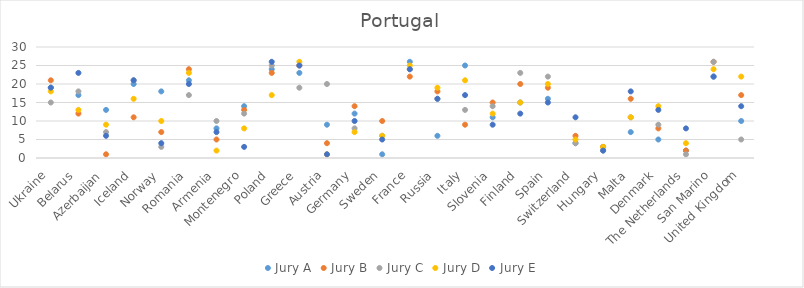
| Category | Jury A | Jury B | Jury C | Jury D | Jury E |
|---|---|---|---|---|---|
| Ukraine | 19 | 21 | 15 | 18 | 19 |
| Belarus | 17 | 12 | 18 | 13 | 23 |
| Azerbaijan | 13 | 1 | 7 | 9 | 6 |
| Iceland | 20 | 11 | 21 | 16 | 21 |
| Norway | 18 | 7 | 3 | 10 | 4 |
| Romania | 21 | 24 | 17 | 23 | 20 |
| Armenia | 8 | 5 | 10 | 2 | 7 |
| Montenegro | 14 | 13 | 12 | 8 | 3 |
| Poland | 24 | 23 | 25 | 17 | 26 |
| Greece | 23 | 25 | 19 | 26 | 25 |
| Austria | 9 | 4 | 20 | 1 | 1 |
| Germany | 12 | 14 | 8 | 7 | 10 |
| Sweden | 1 | 10 | 6 | 6 | 5 |
| France | 26 | 22 | 24 | 25 | 24 |
| Russia | 6 | 18 | 16 | 19 | 16 |
| Italy | 25 | 9 | 13 | 21 | 17 |
| Slovenia | 11 | 15 | 14 | 12 | 9 |
| Finland | 15 | 20 | 23 | 15 | 12 |
| Spain | 16 | 19 | 22 | 20 | 15 |
| Switzerland | 4 | 6 | 4 | 5 | 11 |
| Hungary | 3 | 3 | 2 | 3 | 2 |
| Malta | 7 | 16 | 11 | 11 | 18 |
| Denmark | 5 | 8 | 9 | 14 | 13 |
| The Netherlands | 2 | 2 | 1 | 4 | 8 |
| San Marino | 22 | 26 | 26 | 24 | 22 |
| United Kingdom | 10 | 17 | 5 | 22 | 14 |